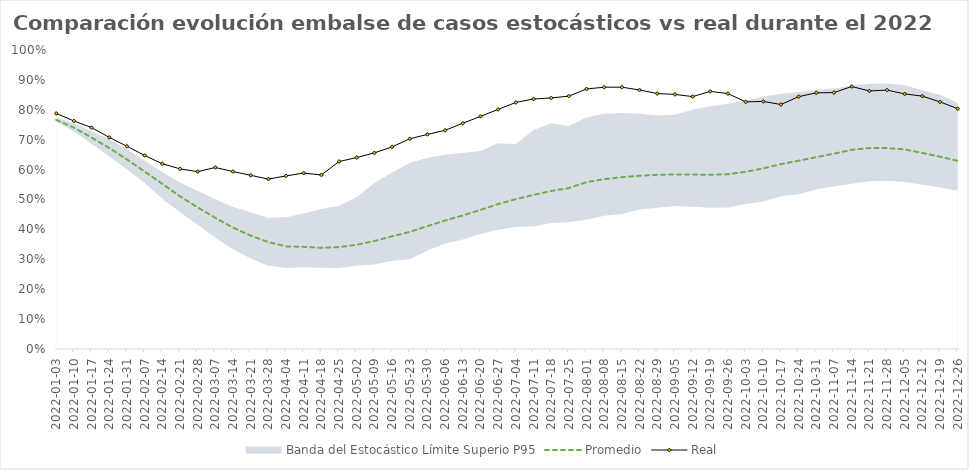
| Category | Promedio | Real |
|---|---|---|
| 2022-01-03 | 0.766 | 0.788 |
| 2022-01-10 | 0.74 | 0.763 |
| 2022-01-17 | 0.707 | 0.74 |
| 2022-01-24 | 0.672 | 0.708 |
| 2022-01-31 | 0.634 | 0.678 |
| 2022-02-07 | 0.593 | 0.647 |
| 2022-02-14 | 0.552 | 0.62 |
| 2022-02-21 | 0.511 | 0.603 |
| 2022-02-28 | 0.473 | 0.593 |
| 2022-03-07 | 0.439 | 0.607 |
| 2022-03-14 | 0.406 | 0.593 |
| 2022-03-21 | 0.379 | 0.581 |
| 2022-03-28 | 0.358 | 0.568 |
| 2022-04-04 | 0.343 | 0.579 |
| 2022-04-11 | 0.342 | 0.588 |
| 2022-04-18 | 0.338 | 0.582 |
| 2022-04-25 | 0.341 | 0.627 |
| 2022-05-02 | 0.349 | 0.64 |
| 2022-05-09 | 0.361 | 0.656 |
| 2022-05-16 | 0.377 | 0.676 |
| 2022-05-23 | 0.392 | 0.703 |
| 2022-05-30 | 0.411 | 0.718 |
| 2022-06-06 | 0.43 | 0.732 |
| 2022-06-13 | 0.447 | 0.755 |
| 2022-06-20 | 0.465 | 0.778 |
| 2022-06-27 | 0.485 | 0.801 |
| 2022-07-04 | 0.501 | 0.824 |
| 2022-07-11 | 0.515 | 0.836 |
| 2022-07-18 | 0.529 | 0.839 |
| 2022-07-25 | 0.538 | 0.846 |
| 2022-08-01 | 0.558 | 0.87 |
| 2022-08-08 | 0.568 | 0.876 |
| 2022-08-15 | 0.575 | 0.876 |
| 2022-08-22 | 0.579 | 0.866 |
| 2022-08-29 | 0.583 | 0.854 |
| 2022-09-05 | 0.584 | 0.851 |
| 2022-09-12 | 0.583 | 0.844 |
| 2022-09-19 | 0.583 | 0.862 |
| 2022-09-26 | 0.584 | 0.854 |
| 2022-10-03 | 0.593 | 0.827 |
| 2022-10-10 | 0.604 | 0.828 |
| 2022-10-17 | 0.618 | 0.818 |
| 2022-10-24 | 0.63 | 0.844 |
| 2022-10-31 | 0.642 | 0.857 |
| 2022-11-07 | 0.653 | 0.858 |
| 2022-11-14 | 0.666 | 0.878 |
| 2022-11-21 | 0.672 | 0.863 |
| 2022-11-28 | 0.672 | 0.866 |
| 2022-12-05 | 0.668 | 0.853 |
| 2022-12-12 | 0.656 | 0.846 |
| 2022-12-19 | 0.643 | 0.826 |
| 2022-12-26 | 0.629 | 0.804 |